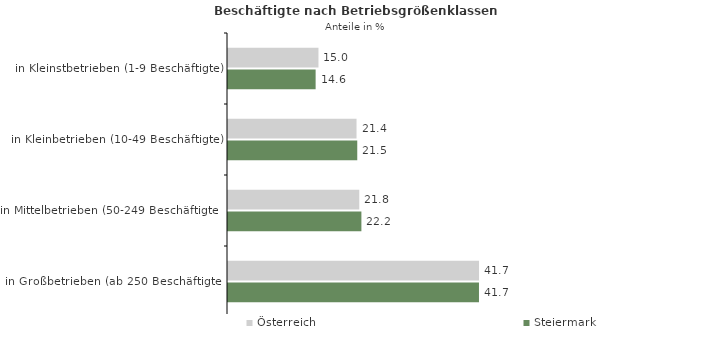
| Category | Österreich | Steiermark |
|---|---|---|
| in Kleinstbetrieben (1-9 Beschäftigte) | 15.046 | 14.574 |
| in Kleinbetrieben (10-49 Beschäftigte) | 21.375 | 21.498 |
| in Mittelbetrieben (50-249 Beschäftigte) | 21.831 | 22.187 |
| in Großbetrieben (ab 250 Beschäftigte) | 41.748 | 41.742 |